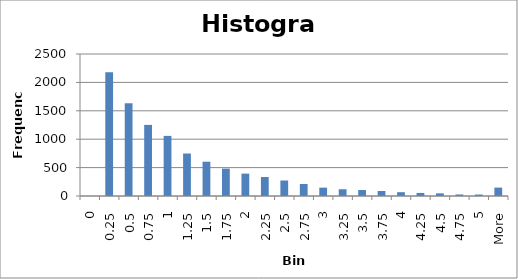
| Category | Series 0 |
|---|---|
| 0.00 | 0 |
| 0.25 | 2180 |
| 0.50 | 1635 |
| 0.75 | 1252 |
| 1.00 | 1058 |
| 1.25 | 748 |
| 1.50 | 604 |
| 1.75 | 482 |
| 2.00 | 394 |
| 2.25 | 335 |
| 2.50 | 273 |
| 2.75 | 211 |
| 3.00 | 147 |
| 3.25 | 119 |
| 3.50 | 105 |
| 3.75 | 88 |
| 4.00 | 67 |
| 4.25 | 54 |
| 4.50 | 47 |
| 4.75 | 27 |
| 5.00 | 26 |
| More | 148 |